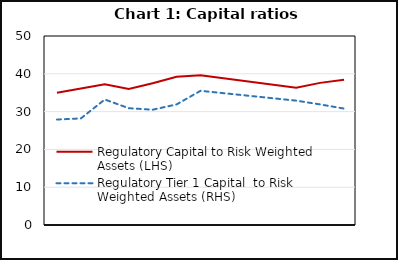
| Category | Regulatory Capital to Risk Weighted Assets (LHS) | Regulatory Tier 1 Capital  to Risk Weighted Assets (RHS) |
|---|---|---|
| nan | 35 | 27.9 |
| 2019.0 | 36.1 | 28.2 |
| nan | 37.2 | 33.2 |
| nan | 36 | 30.9 |
| nan | 37.5 | 30.5 |
| 2020.0 | 39.2 | 31.9 |
| nan | 39.6 | 35.5 |
| nan | 0 | 0 |
| nan | 0 | 0 |
| 2021.0 | 0 | 0 |
| nan | 36.3 | 32.9 |
| nan | 37.6 | 31.9 |
| 2022.0 | 38.4 | 30.8 |